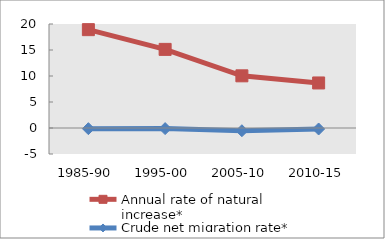
| Category | Annual rate of natural increase* | Crude net migration rate* |
|---|---|---|
| 1985-90 | 18.914 | -0.129 |
| 1995-00 | 15.118 | -0.119 |
| 2005-10 | 10.035 | -0.524 |
| 2010-15 | 8.661 | -0.191 |